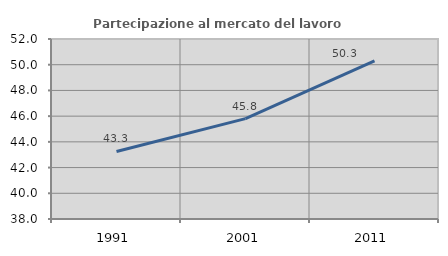
| Category | Partecipazione al mercato del lavoro  femminile |
|---|---|
| 1991.0 | 43.255 |
| 2001.0 | 45.807 |
| 2011.0 | 50.295 |